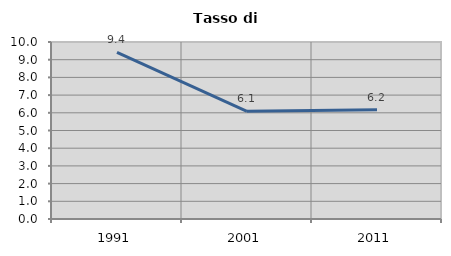
| Category | Tasso di disoccupazione   |
|---|---|
| 1991.0 | 9.42 |
| 2001.0 | 6.081 |
| 2011.0 | 6.176 |